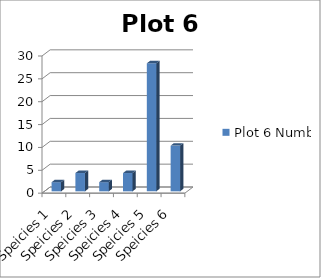
| Category | Plot 6 Number |
|---|---|
| Speicies 1 | 2 |
| Speicies 2 | 4 |
| Speicies 3 | 2 |
| Speicies 4 | 4 |
| Speicies 5 | 28 |
| Speicies 6 | 10 |